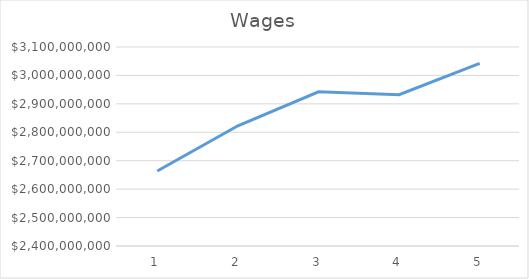
| Category | Series 0 |
|---|---|
| 0 | 2663843000 |
| 1 | 2822780000 |
| 2 | 2942402000 |
| 3 | 2932415000 |
| 4 | 3042162000 |